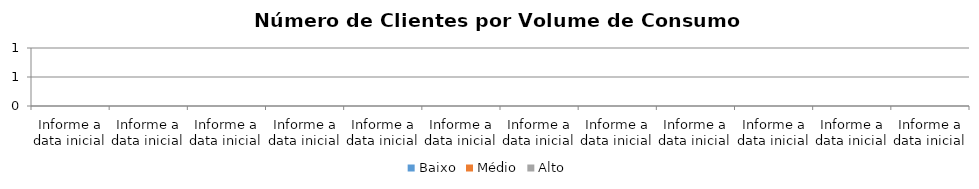
| Category | Baixo | Médio | Alto |
|---|---|---|---|
| Informe a data inicial | 0 | 0 | 0 |
| Informe a data inicial | 0 | 0 | 0 |
| Informe a data inicial | 0 | 0 | 0 |
| Informe a data inicial | 0 | 0 | 0 |
| Informe a data inicial | 0 | 0 | 0 |
| Informe a data inicial | 0 | 0 | 0 |
| Informe a data inicial | 0 | 0 | 0 |
| Informe a data inicial | 0 | 0 | 0 |
| Informe a data inicial | 0 | 0 | 0 |
| Informe a data inicial | 0 | 0 | 0 |
| Informe a data inicial | 0 | 0 | 0 |
| Informe a data inicial | 0 | 0 | 0 |